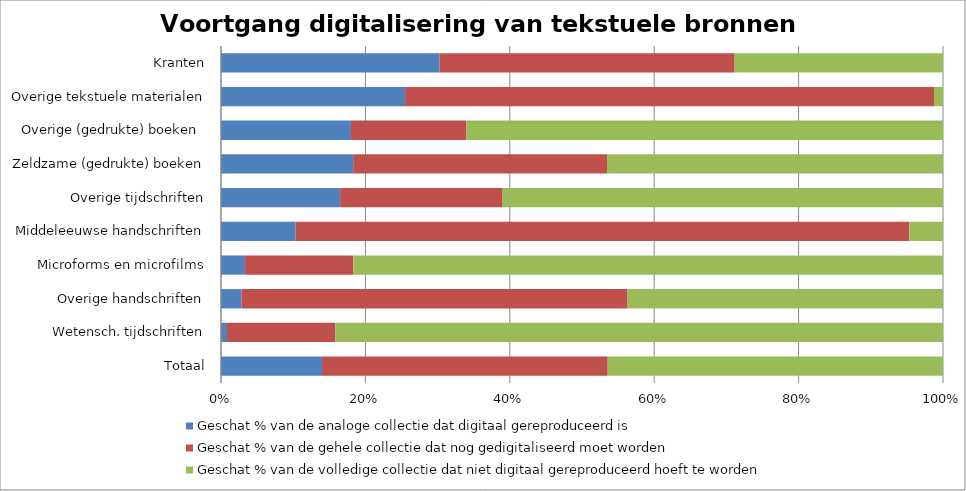
| Category | Geschat % van de analoge collectie dat digitaal gereproduceerd is  | Geschat % van de gehele collectie dat nog gedigitaliseerd moet worden | Geschat % van de volledige collectie dat niet digitaal gereproduceerd hoeft te worden |
|---|---|---|---|
| Totaal | 13.992 | 39.585 | 46.442 |
| Wetensch. tijdschriften | 0.833 | 15 | 84.167 |
| Overige handschriften | 2.833 | 53.5 | 43.833 |
| Microforms en microfilms | 3.333 | 15 | 81.667 |
| Middeleeuwse handschriften | 10.333 | 85 | 4.667 |
| Overige tijdschriften | 16.5 | 22.5 | 61 |
| Zeldzame (gedrukte) boeken | 18.308 | 35.154 | 46.538 |
| Overige (gedrukte) boeken  | 18 | 16 | 66 |
| Overige tekstuele materialen | 25.5 | 73.25 | 1.25 |
| Kranten | 30.286 | 40.857 | 28.857 |